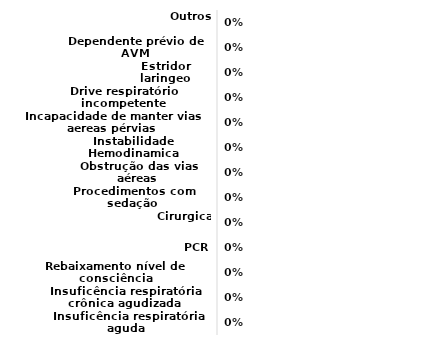
| Category | Series 0 |
|---|---|
| Insuficência respiratória aguda | 0 |
| Insuficência respiratória crônica agudizada | 0 |
| Rebaixamento nível de consciência | 0 |
| PCR | 0 |
| Cirurgica | 0 |
| Procedimentos com sedação | 0 |
| Obstrução das vias aéreas | 0 |
| Instabilidade Hemodinamica | 0 |
| Incapacidade de manter vias aereas pérvias | 0 |
| Drive respiratório incompetente | 0 |
| Estridor laringeo | 0 |
| Dependente prévio de AVM | 0 |
| Outros | 0 |